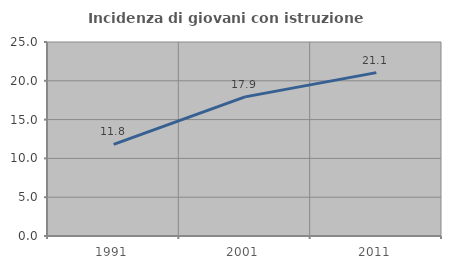
| Category | Incidenza di giovani con istruzione universitaria |
|---|---|
| 1991.0 | 11.811 |
| 2001.0 | 17.928 |
| 2011.0 | 21.053 |